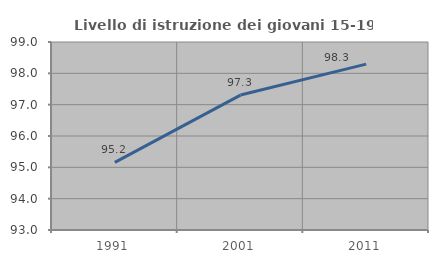
| Category | Livello di istruzione dei giovani 15-19 anni |
|---|---|
| 1991.0 | 95.16 |
| 2001.0 | 97.307 |
| 2011.0 | 98.295 |